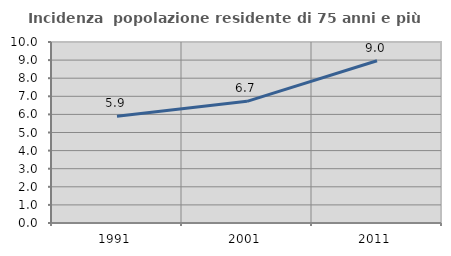
| Category | Incidenza  popolazione residente di 75 anni e più |
|---|---|
| 1991.0 | 5.904 |
| 2001.0 | 6.722 |
| 2011.0 | 8.962 |